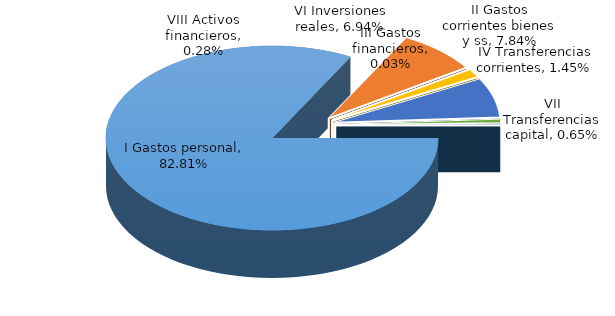
| Category | Series 0 |
|---|---|
| I Gastos personal | 0.828 |
| II Gastos corrientes bienes y ss | 0.078 |
| III Gastos financieros | 0 |
| IV Transferencias corrientes | 0.014 |
| VI Inversiones reales | 0.069 |
| VII Transferencias capital | 0.006 |
| VIII Activos financieros | 0.003 |